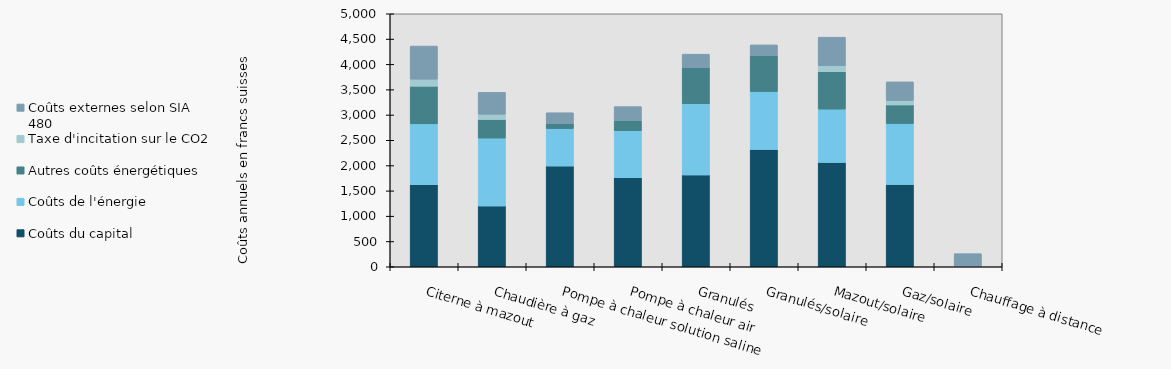
| Category | Coûts du capital | Coûts de l'énergie | Autres coûts énergétiques | Taxe d'incitation sur le CO2 | Coûts externes selon SIA 480 |
|---|---|---|---|---|---|
| Citerne à mazout | 1621.098 | 1203.341 | 743.273 | 139.496 | 654.543 |
| Chaudière à gaz | 1201.28 | 1342.513 | 367 | 104.509 | 431.998 |
| Pompe à chaleur solution saline | 1989.776 | 742.762 | 100 | 0 | 211.764 |
| Pompe à chaleur air | 1759.276 | 929.766 | 200 | 0 | 276.922 |
| Granulés | 1815.293 | 1406.156 | 717.017 | 0 | 263.414 |
| Granulés/solaire | 2317.003 | 1145.925 | 711.613 | 0 | 210.731 |
| Mazout/solaire | 2061.078 | 1054.277 | 739.984 | 119.782 | 562.039 |
| Gaz/solaire | 1624.288 | 1207.136 | 367 | 88.833 | 367.199 |
| Chauffage à distance | 0 | 0 | 0 | 0 | 259.199 |